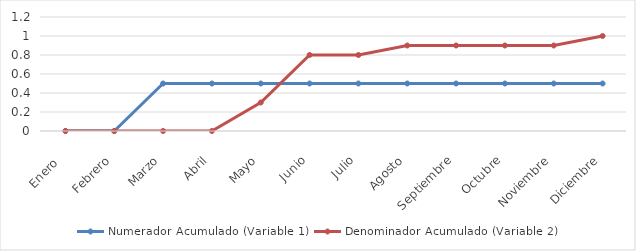
| Category | Numerador Acumulado (Variable 1) | Denominador Acumulado (Variable 2) |
|---|---|---|
| Enero  | 0 | 0 |
| Febrero | 0 | 0 |
| Marzo | 0.5 | 0 |
| Abril | 0.5 | 0 |
| Mayo | 0.5 | 0.3 |
| Junio | 0.5 | 0.8 |
| Julio | 0.5 | 0.8 |
| Agosto | 0.5 | 0.9 |
| Septiembre | 0.5 | 0.9 |
| Octubre | 0.5 | 0.9 |
| Noviembre | 0.5 | 0.9 |
| Diciembre | 0.5 | 1 |